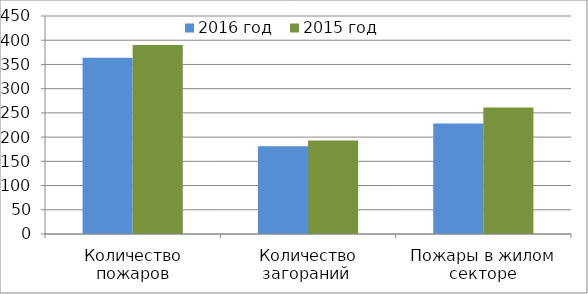
| Category | 2016 год | 2015 год |
|---|---|---|
| Количество пожаров | 364 | 390 |
| Количество загораний  | 181 | 193 |
| Пожары в жилом секторе | 228 | 261 |